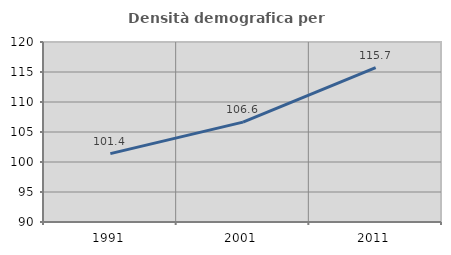
| Category | Densità demografica |
|---|---|
| 1991.0 | 101.394 |
| 2001.0 | 106.647 |
| 2011.0 | 115.736 |